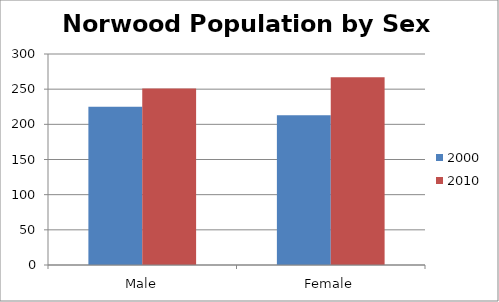
| Category | 2000 | 2010 |
|---|---|---|
| Male | 225 | 251 |
| Female | 213 | 267 |